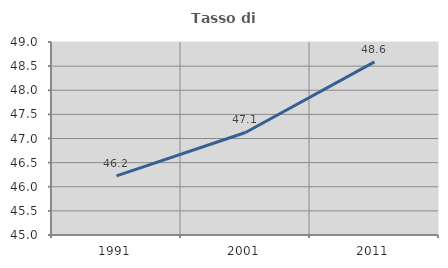
| Category | Tasso di occupazione   |
|---|---|
| 1991.0 | 46.226 |
| 2001.0 | 47.125 |
| 2011.0 | 48.589 |